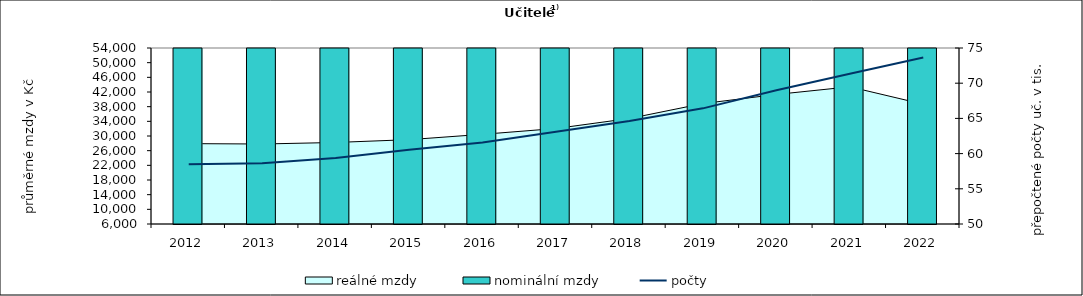
| Category | nominální mzdy |
|---|---|
| 2012.0 | 27331.912 |
| 2013.0 | 27622.984 |
| 2014.0 | 28151.471 |
| 2015.0 | 29004.566 |
| 2016.0 | 30670.782 |
| 2017.0 | 33039.683 |
| 2018.0 | 36622.6 |
| 2019.0 | 42070.098 |
| 2020.0 | 46210.138 |
| 2021.0 | 49975.1 |
| 2022.0 | 50351.429 |